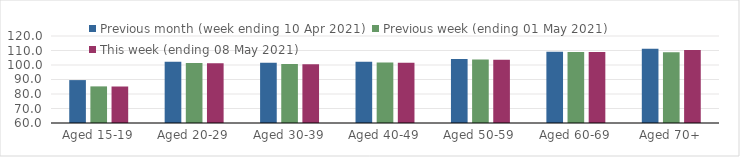
| Category | Previous month (week ending 10 Apr 2021) | Previous week (ending 01 May 2021) | This week (ending 08 May 2021) |
|---|---|---|---|
| Aged 15-19 | 89.59 | 85.25 | 85.17 |
| Aged 20-29 | 102.29 | 101.32 | 101.14 |
| Aged 30-39 | 101.51 | 100.72 | 100.58 |
| Aged 40-49 | 102.31 | 101.65 | 101.49 |
| Aged 50-59 | 104.12 | 103.71 | 103.62 |
| Aged 60-69 | 109.14 | 109 | 108.92 |
| Aged 70+ | 111.29 | 108.84 | 110.41 |